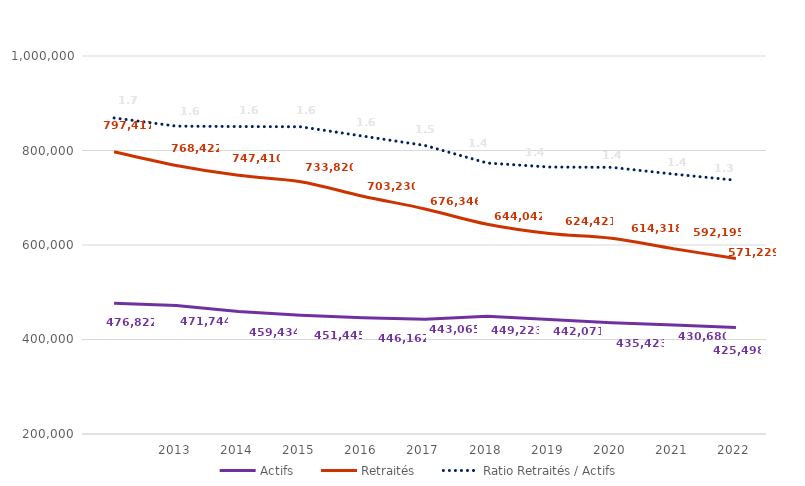
| Category | Actifs | Retraités |
|---|---|---|
|   | 476822 | 797417 |
| 2013 | 471744 | 768422 |
| 2014 | 459434 | 747410 |
| 2015 | 451445 | 733820 |
| 2016 | 446162 | 703230 |
| 2017 | 443065 | 676346 |
| 2018 | 449223 | 644042 |
| 2019 | 442071 | 624421 |
| 2020 | 435423 | 614318 |
| 2021 | 430680 | 592195 |
| 2022 | 425498 | 571229 |